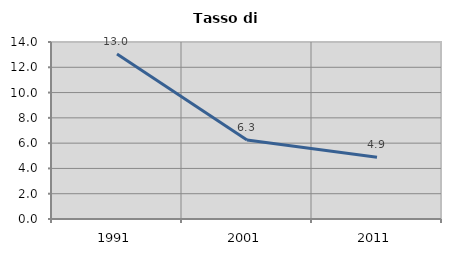
| Category | Tasso di disoccupazione   |
|---|---|
| 1991.0 | 13.043 |
| 2001.0 | 6.25 |
| 2011.0 | 4.878 |